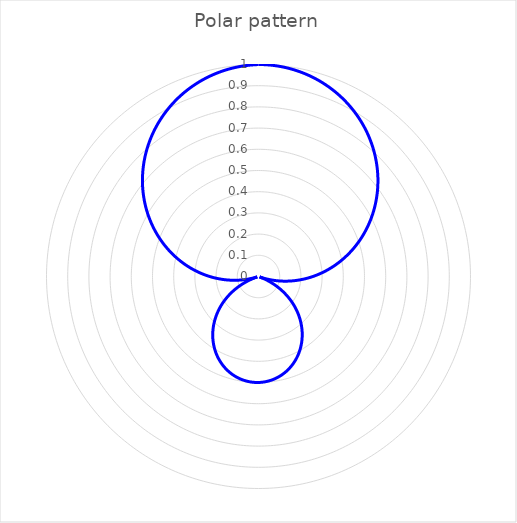
| Category | Series 0 |
|---|---|
| 0.0 | 1 |
| 1.0 | 1 |
| 2.0 | 1 |
| 3.0 | 0.999 |
| 4.0 | 0.998 |
| 5.0 | 0.997 |
| 6.0 | 0.996 |
| 7.0 | 0.994 |
| 8.0 | 0.993 |
| 9.0 | 0.991 |
| 10.0 | 0.989 |
| 11.0 | 0.986 |
| 12.0 | 0.984 |
| 13.0 | 0.981 |
| 14.0 | 0.978 |
| 15.0 | 0.974 |
| 16.0 | 0.971 |
| 17.0 | 0.967 |
| 18.0 | 0.963 |
| 19.0 | 0.959 |
| 20.0 | 0.955 |
| 21.0 | 0.95 |
| 22.0 | 0.945 |
| 23.0 | 0.94 |
| 24.0 | 0.935 |
| 25.0 | 0.93 |
| 26.0 | 0.924 |
| 27.0 | 0.918 |
| 28.0 | 0.912 |
| 29.0 | 0.906 |
| 30.0 | 0.9 |
| 31.0 | 0.893 |
| 32.0 | 0.886 |
| 33.0 | 0.879 |
| 34.0 | 0.872 |
| 35.0 | 0.864 |
| 36.0 | 0.857 |
| 37.0 | 0.849 |
| 38.0 | 0.841 |
| 39.0 | 0.833 |
| 40.0 | 0.825 |
| 41.0 | 0.816 |
| 42.0 | 0.807 |
| 43.0 | 0.799 |
| 44.0 | 0.79 |
| 45.0 | 0.78 |
| 46.0 | 0.771 |
| 47.0 | 0.761 |
| 48.0 | 0.752 |
| 49.0 | 0.742 |
| 50.0 | 0.732 |
| 51.0 | 0.722 |
| 52.0 | 0.712 |
| 53.0 | 0.701 |
| 54.0 | 0.691 |
| 55.0 | 0.68 |
| 56.0 | 0.669 |
| 57.0 | 0.658 |
| 58.0 | 0.647 |
| 59.0 | 0.636 |
| 60.0 | 0.625 |
| 61.0 | 0.614 |
| 62.0 | 0.602 |
| 63.0 | 0.59 |
| 64.0 | 0.579 |
| 65.0 | 0.567 |
| 66.0 | 0.555 |
| 67.0 | 0.543 |
| 68.0 | 0.531 |
| 69.0 | 0.519 |
| 70.0 | 0.507 |
| 71.0 | 0.494 |
| 72.0 | 0.482 |
| 73.0 | 0.469 |
| 74.0 | 0.457 |
| 75.0 | 0.444 |
| 76.0 | 0.431 |
| 77.0 | 0.419 |
| 78.0 | 0.406 |
| 79.0 | 0.393 |
| 80.0 | 0.38 |
| 81.0 | 0.367 |
| 82.0 | 0.354 |
| 83.0 | 0.341 |
| 84.0 | 0.328 |
| 85.0 | 0.315 |
| 86.0 | 0.302 |
| 87.0 | 0.289 |
| 88.0 | 0.276 |
| 89.0 | 0.263 |
| 90.0 | 0.25 |
| 91.0 | 0.237 |
| 92.0 | 0.224 |
| 93.0 | 0.211 |
| 94.0 | 0.198 |
| 95.0 | 0.185 |
| 96.0 | 0.172 |
| 97.0 | 0.159 |
| 98.0 | 0.146 |
| 99.0 | 0.133 |
| 100.0 | 0.12 |
| 101.0 | 0.107 |
| 102.0 | 0.094 |
| 103.0 | 0.081 |
| 104.0 | 0.069 |
| 105.0 | 0.056 |
| 106.0 | 0.043 |
| 107.0 | 0.031 |
| 108.0 | 0.018 |
| 109.0 | 0.006 |
| 110.0 | 0.007 |
| 111.0 | 0.019 |
| 112.0 | 0.031 |
| 113.0 | 0.043 |
| 114.0 | 0.055 |
| 115.0 | 0.067 |
| 116.0 | 0.079 |
| 117.0 | 0.09 |
| 118.0 | 0.102 |
| 119.0 | 0.114 |
| 120.0 | 0.125 |
| 121.0 | 0.136 |
| 122.0 | 0.147 |
| 123.0 | 0.158 |
| 124.0 | 0.169 |
| 125.0 | 0.18 |
| 126.0 | 0.191 |
| 127.0 | 0.201 |
| 128.0 | 0.212 |
| 129.0 | 0.222 |
| 130.0 | 0.232 |
| 131.0 | 0.242 |
| 132.0 | 0.252 |
| 133.0 | 0.261 |
| 134.0 | 0.271 |
| 135.0 | 0.28 |
| 136.0 | 0.29 |
| 137.0 | 0.299 |
| 138.0 | 0.307 |
| 139.0 | 0.316 |
| 140.0 | 0.325 |
| 141.0 | 0.333 |
| 142.0 | 0.341 |
| 143.0 | 0.349 |
| 144.0 | 0.357 |
| 145.0 | 0.364 |
| 146.0 | 0.372 |
| 147.0 | 0.379 |
| 148.0 | 0.386 |
| 149.0 | 0.393 |
| 150.0 | 0.4 |
| 151.0 | 0.406 |
| 152.0 | 0.412 |
| 153.0 | 0.418 |
| 154.0 | 0.424 |
| 155.0 | 0.43 |
| 156.0 | 0.435 |
| 157.0 | 0.44 |
| 158.0 | 0.445 |
| 159.0 | 0.45 |
| 160.0 | 0.455 |
| 161.0 | 0.459 |
| 162.0 | 0.463 |
| 163.0 | 0.467 |
| 164.0 | 0.471 |
| 165.0 | 0.474 |
| 166.0 | 0.478 |
| 167.0 | 0.481 |
| 168.0 | 0.484 |
| 169.0 | 0.486 |
| 170.0 | 0.489 |
| 171.0 | 0.491 |
| 172.0 | 0.493 |
| 173.0 | 0.494 |
| 174.0 | 0.496 |
| 175.0 | 0.497 |
| 176.0 | 0.498 |
| 177.0 | 0.499 |
| 178.0 | 0.5 |
| 179.0 | 0.5 |
| 180.0 | 0.5 |
| 181.0 | 0.5 |
| 182.0 | 0.5 |
| 183.0 | 0.499 |
| 184.0 | 0.498 |
| 185.0 | 0.497 |
| 186.0 | 0.496 |
| 187.0 | 0.494 |
| 188.0 | 0.493 |
| 189.0 | 0.491 |
| 190.0 | 0.489 |
| 191.0 | 0.486 |
| 192.0 | 0.484 |
| 193.0 | 0.481 |
| 194.0 | 0.478 |
| 195.0 | 0.474 |
| 196.0 | 0.471 |
| 197.0 | 0.467 |
| 198.0 | 0.463 |
| 199.0 | 0.459 |
| 200.0 | 0.455 |
| 201.0 | 0.45 |
| 202.0 | 0.445 |
| 203.0 | 0.44 |
| 204.0 | 0.435 |
| 205.0 | 0.43 |
| 206.0 | 0.424 |
| 207.0 | 0.418 |
| 208.0 | 0.412 |
| 209.0 | 0.406 |
| 210.0 | 0.4 |
| 211.0 | 0.393 |
| 212.0 | 0.386 |
| 213.0 | 0.379 |
| 214.0 | 0.372 |
| 215.0 | 0.364 |
| 216.0 | 0.357 |
| 217.0 | 0.349 |
| 218.0 | 0.341 |
| 219.0 | 0.333 |
| 220.0 | 0.325 |
| 221.0 | 0.316 |
| 222.0 | 0.307 |
| 223.0 | 0.299 |
| 224.0 | 0.29 |
| 225.0 | 0.28 |
| 226.0 | 0.271 |
| 227.0 | 0.261 |
| 228.0 | 0.252 |
| 229.0 | 0.242 |
| 230.0 | 0.232 |
| 231.0 | 0.222 |
| 232.0 | 0.212 |
| 233.0 | 0.201 |
| 234.0 | 0.191 |
| 235.0 | 0.18 |
| 236.0 | 0.169 |
| 237.0 | 0.158 |
| 238.0 | 0.147 |
| 239.0 | 0.136 |
| 240.0 | 0.125 |
| 241.0 | 0.114 |
| 242.0 | 0.102 |
| 243.0 | 0.09 |
| 244.0 | 0.079 |
| 245.0 | 0.067 |
| 246.0 | 0.055 |
| 247.0 | 0.043 |
| 248.0 | 0.031 |
| 249.0 | 0.019 |
| 250.0 | 0.007 |
| 251.0 | 0.006 |
| 252.0 | 0.018 |
| 253.0 | 0.031 |
| 254.0 | 0.043 |
| 255.0 | 0.056 |
| 256.0 | 0.069 |
| 257.0 | 0.081 |
| 258.0 | 0.094 |
| 259.0 | 0.107 |
| 260.0 | 0.12 |
| 261.0 | 0.133 |
| 262.0 | 0.146 |
| 263.0 | 0.159 |
| 264.0 | 0.172 |
| 265.0 | 0.185 |
| 266.0 | 0.198 |
| 267.0 | 0.211 |
| 268.0 | 0.224 |
| 269.0 | 0.237 |
| 270.0 | 0.25 |
| 271.0 | 0.263 |
| 272.0 | 0.276 |
| 273.0 | 0.289 |
| 274.0 | 0.302 |
| 275.0 | 0.315 |
| 276.0 | 0.328 |
| 277.0 | 0.341 |
| 278.0 | 0.354 |
| 279.0 | 0.367 |
| 280.0 | 0.38 |
| 281.0 | 0.393 |
| 282.0 | 0.406 |
| 283.0 | 0.419 |
| 284.0 | 0.431 |
| 285.0 | 0.444 |
| 286.0 | 0.457 |
| 287.0 | 0.469 |
| 288.0 | 0.482 |
| 289.0 | 0.494 |
| 290.0 | 0.507 |
| 291.0 | 0.519 |
| 292.0 | 0.531 |
| 293.0 | 0.543 |
| 294.0 | 0.555 |
| 295.0 | 0.567 |
| 296.0 | 0.579 |
| 297.0 | 0.59 |
| 298.0 | 0.602 |
| 299.0 | 0.614 |
| 300.0 | 0.625 |
| 301.0 | 0.636 |
| 302.0 | 0.647 |
| 303.0 | 0.658 |
| 304.0 | 0.669 |
| 305.0 | 0.68 |
| 306.0 | 0.691 |
| 307.0 | 0.701 |
| 308.0 | 0.712 |
| 309.0 | 0.722 |
| 310.0 | 0.732 |
| 311.0 | 0.742 |
| 312.0 | 0.752 |
| 313.0 | 0.761 |
| 314.0 | 0.771 |
| 315.0 | 0.78 |
| 316.0 | 0.79 |
| 317.0 | 0.799 |
| 318.0 | 0.807 |
| 319.0 | 0.816 |
| 320.0 | 0.825 |
| 321.0 | 0.833 |
| 322.0 | 0.841 |
| 323.0 | 0.849 |
| 324.0 | 0.857 |
| 325.0 | 0.864 |
| 326.0 | 0.872 |
| 327.0 | 0.879 |
| 328.0 | 0.886 |
| 329.0 | 0.893 |
| 330.0 | 0.9 |
| 331.0 | 0.906 |
| 332.0 | 0.912 |
| 333.0 | 0.918 |
| 334.0 | 0.924 |
| 335.0 | 0.93 |
| 336.0 | 0.935 |
| 337.0 | 0.94 |
| 338.0 | 0.945 |
| 339.0 | 0.95 |
| 340.0 | 0.955 |
| 341.0 | 0.959 |
| 342.0 | 0.963 |
| 343.0 | 0.967 |
| 344.0 | 0.971 |
| 345.0 | 0.974 |
| 346.0 | 0.978 |
| 347.0 | 0.981 |
| 348.0 | 0.984 |
| 349.0 | 0.986 |
| 350.0 | 0.989 |
| 351.0 | 0.991 |
| 352.0 | 0.993 |
| 353.0 | 0.994 |
| 354.0 | 0.996 |
| 355.0 | 0.997 |
| 356.0 | 0.998 |
| 357.0 | 0.999 |